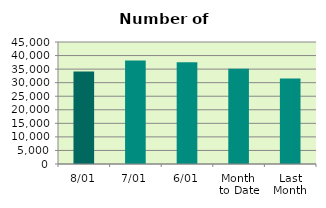
| Category | Series 0 |
|---|---|
| 8/01 | 34130 |
| 7/01 | 38158 |
| 6/01 | 37498 |
| Month 
to Date | 35110.8 |
| Last
Month | 31497.9 |